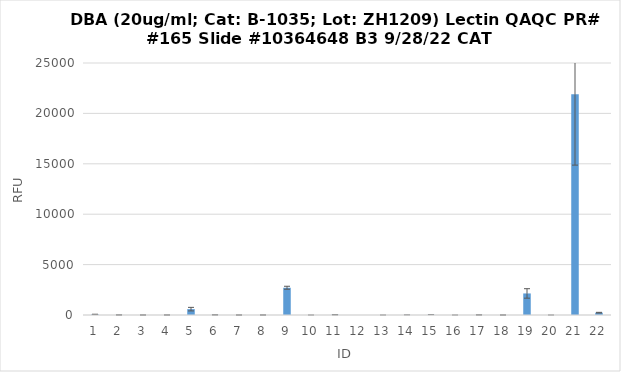
| Category | RFU |
|---|---|
| 0 | 61 |
| 1 | 7.75 |
| 2 | 1.75 |
| 3 | 2.5 |
| 4 | 581.5 |
| 5 | 14.25 |
| 6 | -0.25 |
| 7 | 2.25 |
| 8 | 2702.5 |
| 9 | 0.5 |
| 10 | 28.75 |
| 11 | -5.25 |
| 12 | 0.5 |
| 13 | 6 |
| 14 | 18.75 |
| 15 | 0.25 |
| 16 | 10.25 |
| 17 | 0.75 |
| 18 | 2139 |
| 19 | 0.5 |
| 20 | 21901.25 |
| 21 | 232.25 |